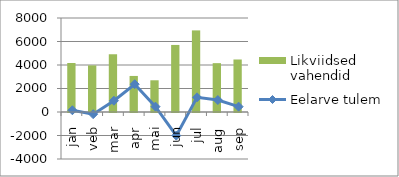
| Category | Likviidsed vahendid |
|---|---|
| jan | 4171.3 |
| veb | 3967.7 |
| mar | 4914.4 |
| apr | 3068.6 |
| mai | 2699.7 |
| jun | 5706.2 |
| jul | 6945.1 |
| aug | 4157.5 |
| sep | 4468.6 |